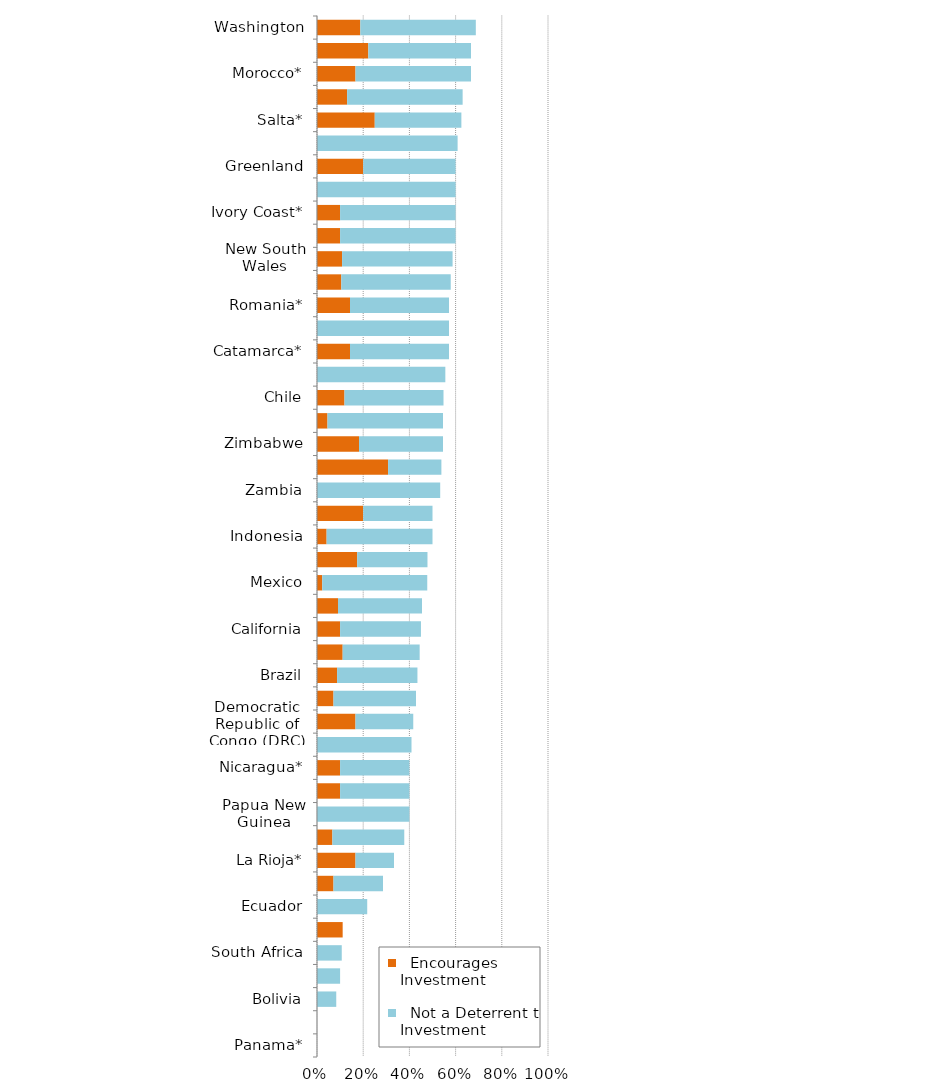
| Category |   Encourages Investment |   Not a Deterrent to Investment |
|---|---|---|
| Panama* | 0 | 0 |
| Venezuela | 0 | 0 |
| Bolivia | 0 | 0.083 |
| Guatemala | 0 | 0.1 |
| South Africa | 0 | 0.107 |
| Chubut* | 0.111 | 0 |
| Ecuador | 0 | 0.217 |
| Santa Cruz | 0.071 | 0.214 |
| La Rioja* | 0.167 | 0.167 |
| Peru | 0.067 | 0.311 |
| Papua New Guinea | 0 | 0.4 |
| Mendoza | 0.1 | 0.3 |
| Nicaragua* | 0.1 | 0.3 |
| Colombia | 0 | 0.409 |
| Democratic Republic of Congo (DRC) | 0.167 | 0.25 |
| San Juan | 0.071 | 0.357 |
| Brazil | 0.087 | 0.348 |
| China* | 0.111 | 0.333 |
| California | 0.1 | 0.35 |
| French Guiana | 0.091 | 0.364 |
| Mexico | 0.023 | 0.455 |
| Victoria | 0.174 | 0.304 |
| Indonesia | 0.042 | 0.458 |
| Russia* | 0.2 | 0.3 |
| Zambia | 0 | 0.533 |
| Fiji | 0.308 | 0.231 |
| Zimbabwe | 0.182 | 0.364 |
| Turkey | 0.045 | 0.5 |
| Chile | 0.119 | 0.429 |
| Dominican Republic* | 0 | 0.556 |
| Catamarca* | 0.143 | 0.429 |
| Suriname* | 0 | 0.571 |
| Romania* | 0.143 | 0.429 |
| New Zealand | 0.105 | 0.474 |
| New South Wales | 0.109 | 0.478 |
| Ghana | 0.1 | 0.5 |
| Ivory Coast* | 0.1 | 0.5 |
| Kenya* | 0 | 0.6 |
| Greenland | 0.2 | 0.4 |
| Tanzania | 0 | 0.609 |
| Salta* | 0.25 | 0.375 |
| Queensland | 0.13 | 0.5 |
| Morocco* | 0.167 | 0.5 |
| Jujuy* | 0.222 | 0.444 |
| Washington | 0.188 | 0.5 |